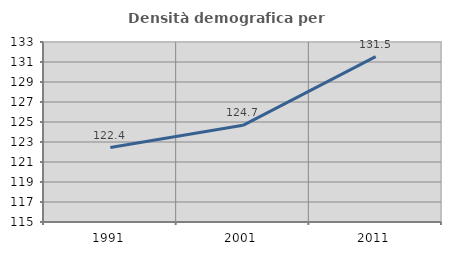
| Category | Densità demografica |
|---|---|
| 1991.0 | 122.444 |
| 2001.0 | 124.671 |
| 2011.0 | 131.535 |